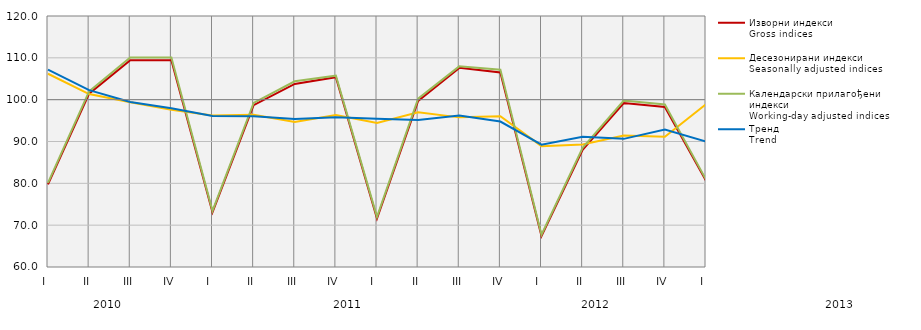
| Category | Изворни индекси
Gross indices | Десезонирани индекси
Seasonally adjusted indices | Календарски прилагођени индекси
Working-day adjusted indices | Тренд
Trend |
|---|---|---|---|---|
| I  | 79.731 | 106.194 | 80.091 | 107.169 |
| II | 101.445 | 101.347 | 101.982 | 102.285 |
| III | 109.413 | 99.369 | 110.069 | 99.43 |
| IV | 109.412 | 97.611 | 110.072 | 97.937 |
| I  | 73.105 | 96.229 | 73.414 | 96.12 |
| II | 98.686 | 96.401 | 99.209 | 96.06 |
| III | 103.754 | 94.654 | 104.385 | 95.37 |
| IV | 105.376 | 96.346 | 105.727 | 95.808 |
| I  | 71.601 | 94.441 | 71.98 | 95.451 |
| II | 99.705 | 96.991 | 100.233 | 95.115 |
| III | 107.6 | 95.767 | 107.963 | 96.241 |
| IV | 106.508 | 96.036 | 107.154 | 94.775 |
| I  | 67.411 | 88.883 | 67.701 | 89.239 |
| II | 88.026 | 89.28 | 88.493 | 91.118 |
| III | 99.2 | 91.451 | 99.805 | 90.633 |
| IV | 98.255 | 91.157 | 98.862 | 92.866 |
| I  | 80.624 | 98.938 | 80.898 | 89.987 |